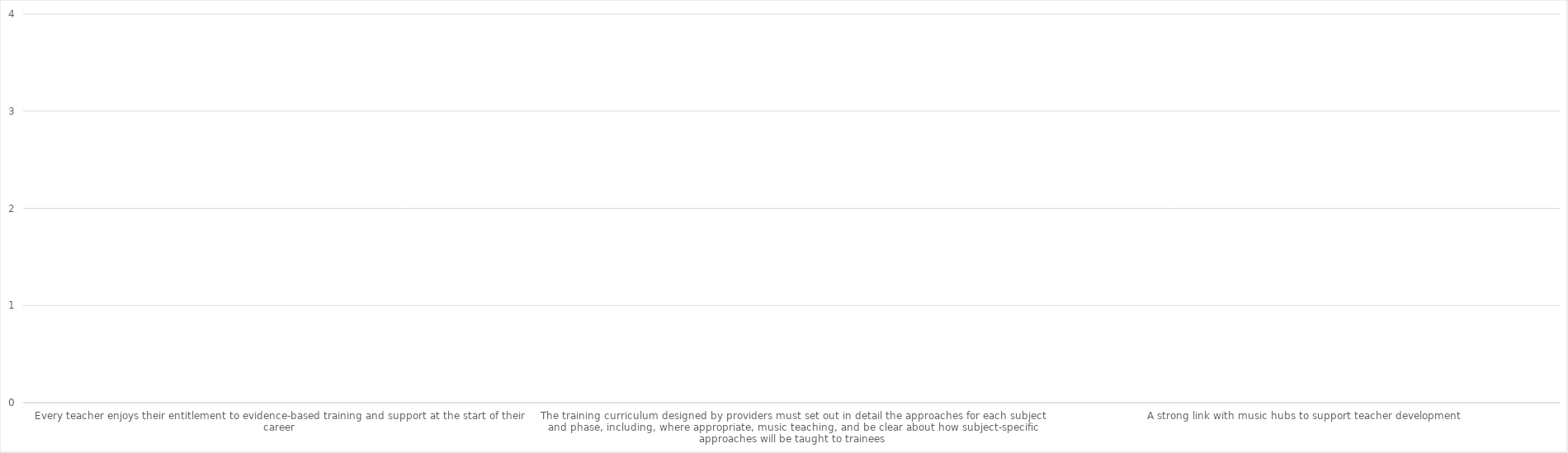
| Category | Series 0 |
|---|---|
| Every teacher enjoys their entitlement to evidence-based training and support at the start of their career | 0 |
| The training curriculum designed by providers must set out in detail the approaches for each subject and phase, including, where appropriate, music teaching, and be clear about how subject-specific approaches will be taught to trainees | 0 |
| A strong link with music hubs to support teacher development | 0 |